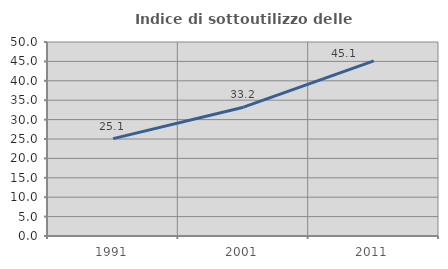
| Category | Indice di sottoutilizzo delle abitazioni  |
|---|---|
| 1991.0 | 25.106 |
| 2001.0 | 33.2 |
| 2011.0 | 45.143 |